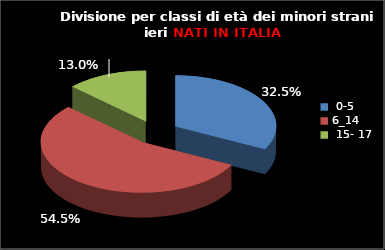
| Category | Series 0 |
|---|---|
| 0-5 | 25 |
| 6_14 | 42 |
| 15- 17 | 10 |